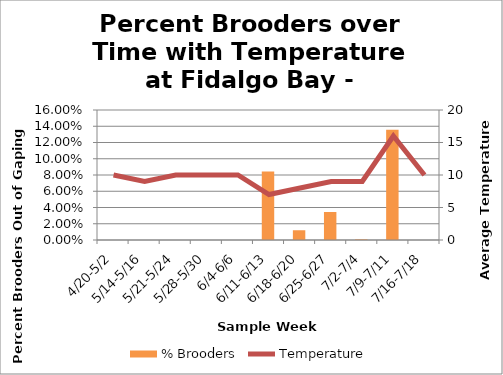
| Category | % Brooders |
|---|---|
| 4/20-5/2 | 0 |
| 5/14-5/16 | 0 |
| 5/21-5/24 | 0 |
| 5/28-5/30 | 0 |
| 6/4-6/6 | 0 |
| 6/11-6/13 | 0.084 |
| 6/18-6/20 | 0.012 |
| 6/25-6/27 | 0.034 |
| 7/2-7/4 | 0.001 |
| 7/9-7/11 | 0.136 |
| 7/16-7/18 | 0 |